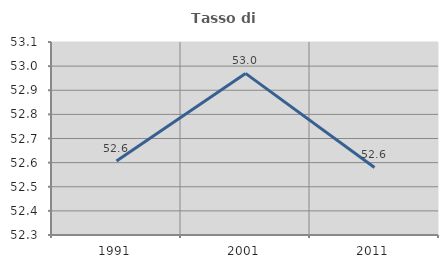
| Category | Tasso di occupazione   |
|---|---|
| 1991.0 | 52.607 |
| 2001.0 | 52.97 |
| 2011.0 | 52.58 |